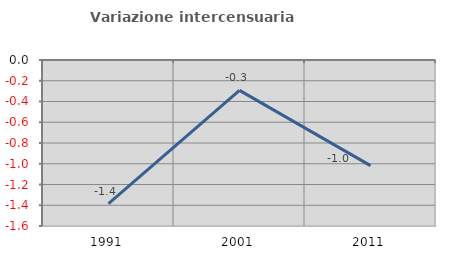
| Category | Variazione intercensuaria annua |
|---|---|
| 1991.0 | -1.385 |
| 2001.0 | -0.293 |
| 2011.0 | -1.018 |